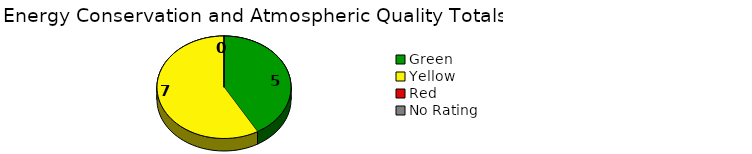
| Category | Series 0 |
|---|---|
| Green | 5 |
| Yellow | 7 |
| Red | 0 |
| No Rating | 0 |